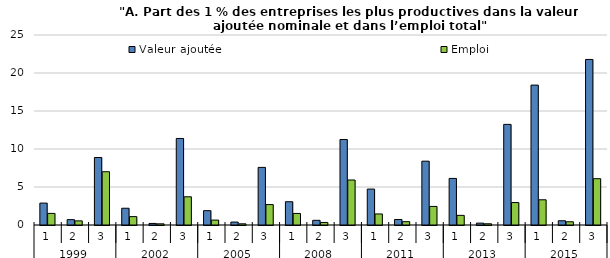
| Category | Valeur ajoutée | Emploi |
|---|---|---|
| 0 | 2.881 | 1.527 |
| 1 | 0.703 | 0.542 |
| 2 | 8.88 | 7.011 |
| 3 | 2.205 | 1.103 |
| 4 | 0.205 | 0.153 |
| 5 | 11.387 | 3.713 |
| 6 | 1.887 | 0.646 |
| 7 | 0.387 | 0.155 |
| 8 | 7.579 | 2.687 |
| 9 | 3.062 | 1.521 |
| 10 | 0.615 | 0.336 |
| 11 | 11.249 | 5.921 |
| 12 | 4.727 | 1.453 |
| 13 | 0.725 | 0.44 |
| 14 | 8.398 | 2.443 |
| 15 | 6.128 | 1.267 |
| 16 | 0.248 | 0.162 |
| 17 | 13.238 | 2.953 |
| 18 | 18.408 | 3.318 |
| 19 | 0.559 | 0.425 |
| 20 | 21.784 | 6.093 |